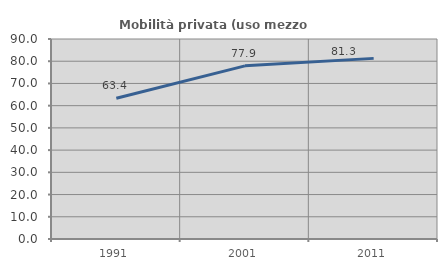
| Category | Mobilità privata (uso mezzo privato) |
|---|---|
| 1991.0 | 63.367 |
| 2001.0 | 77.924 |
| 2011.0 | 81.282 |